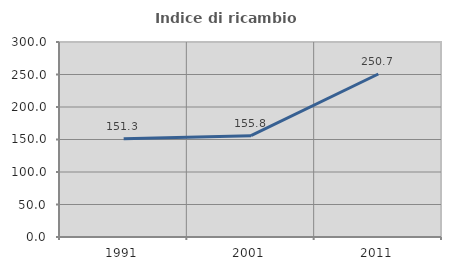
| Category | Indice di ricambio occupazionale  |
|---|---|
| 1991.0 | 151.293 |
| 2001.0 | 155.823 |
| 2011.0 | 250.746 |